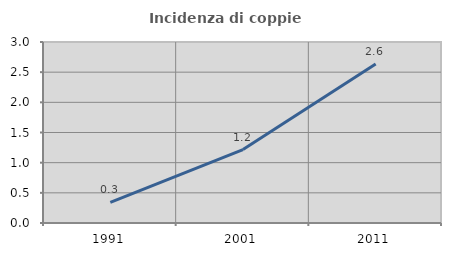
| Category | Incidenza di coppie miste |
|---|---|
| 1991.0 | 0.342 |
| 2001.0 | 1.217 |
| 2011.0 | 2.634 |